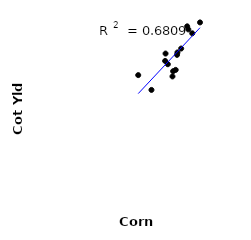
| Category | Series 0 |
|---|---|
| 100.7 | 601 |
| 138.6 | 705 |
| 113.5 | 533 |
| 127.1 | 700 |
| 126.7 | 666 |
| 134.4 | 619 |
| 133.8 | 595 |
| 136.9 | 625 |
| 138.2 | 694 |
| 129.3 | 651 |
| 142.2 | 723 |
| 160.4 | 843 |
| 148.0 | 825 |
| 149.1 | 811 |
| 152.9 | 793 |